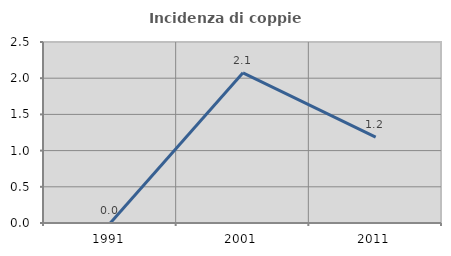
| Category | Incidenza di coppie miste |
|---|---|
| 1991.0 | 0 |
| 2001.0 | 2.075 |
| 2011.0 | 1.186 |